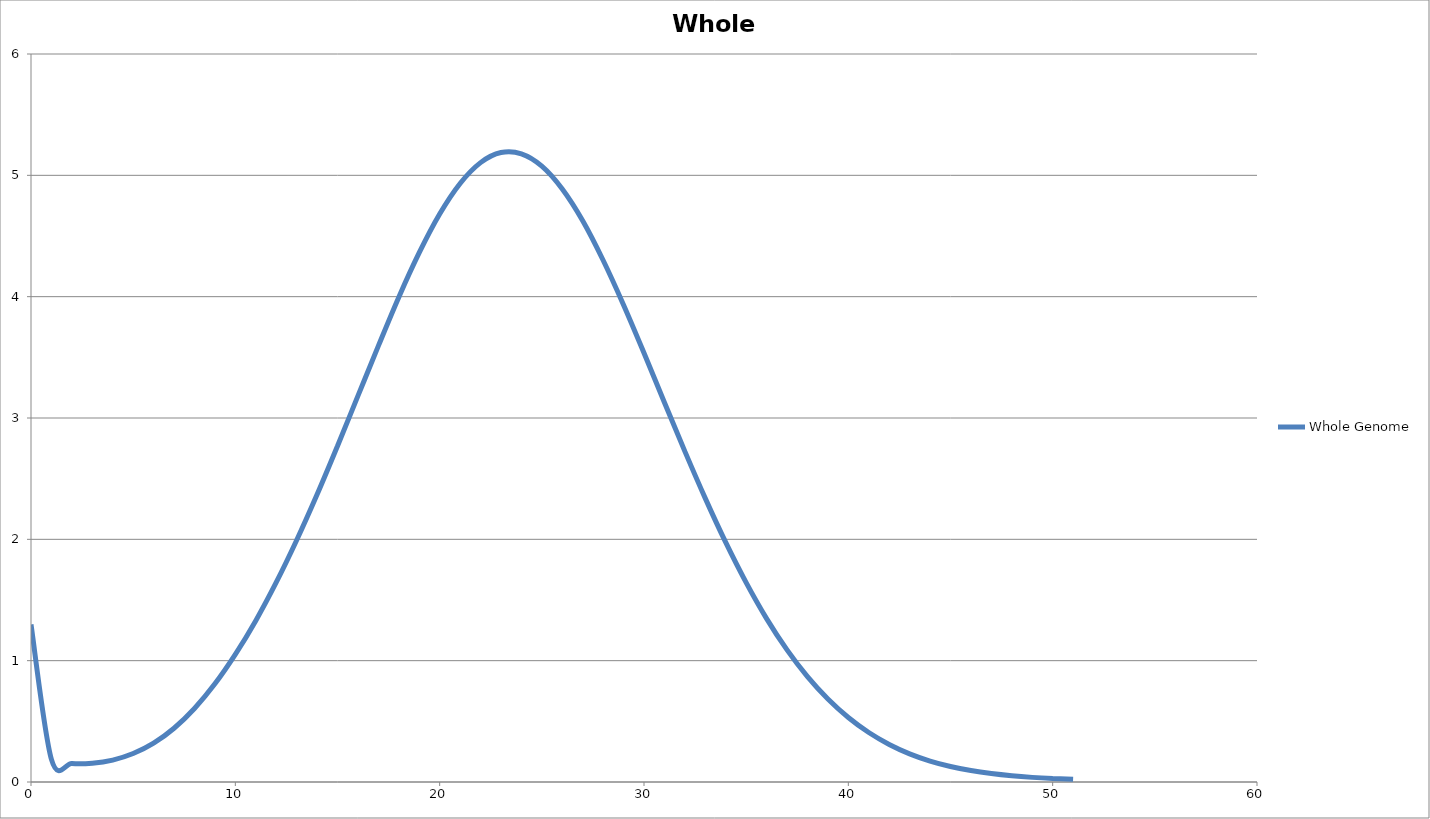
| Category | Whole Genome |
|---|---|
| 0.0 | 1.299 |
| 1.0 | 0.186 |
| 2.0 | 0.153 |
| 3.0 | 0.155 |
| 4.0 | 0.181 |
| 5.0 | 0.234 |
| 6.0 | 0.32 |
| 7.0 | 0.443 |
| 8.0 | 0.606 |
| 9.0 | 0.809 |
| 10.0 | 1.052 |
| 11.0 | 1.33 |
| 12.0 | 1.645 |
| 13.0 | 1.992 |
| 14.0 | 2.369 |
| 15.0 | 2.769 |
| 16.0 | 3.182 |
| 17.0 | 3.594 |
| 18.0 | 3.996 |
| 19.0 | 4.362 |
| 20.0 | 4.681 |
| 21.0 | 4.933 |
| 22.0 | 5.105 |
| 23.0 | 5.188 |
| 24.0 | 5.178 |
| 25.0 | 5.076 |
| 26.0 | 4.888 |
| 27.0 | 4.626 |
| 28.0 | 4.3 |
| 29.0 | 3.932 |
| 30.0 | 3.536 |
| 31.0 | 3.128 |
| 32.0 | 2.725 |
| 33.0 | 2.338 |
| 34.0 | 1.974 |
| 35.0 | 1.643 |
| 36.0 | 1.347 |
| 37.0 | 1.089 |
| 38.0 | 0.868 |
| 39.0 | 0.684 |
| 40.0 | 0.532 |
| 41.0 | 0.408 |
| 42.0 | 0.309 |
| 43.0 | 0.232 |
| 44.0 | 0.173 |
| 45.0 | 0.128 |
| 46.0 | 0.094 |
| 47.0 | 0.069 |
| 48.0 | 0.051 |
| 49.0 | 0.038 |
| 50.0 | 0.029 |
| 51.0 | 0.022 |